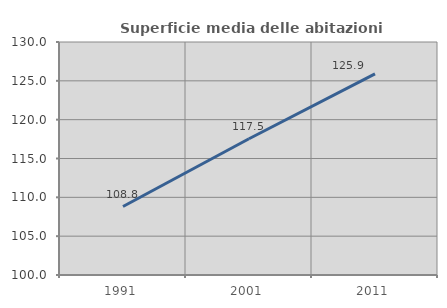
| Category | Superficie media delle abitazioni occupate |
|---|---|
| 1991.0 | 108.815 |
| 2001.0 | 117.543 |
| 2011.0 | 125.889 |